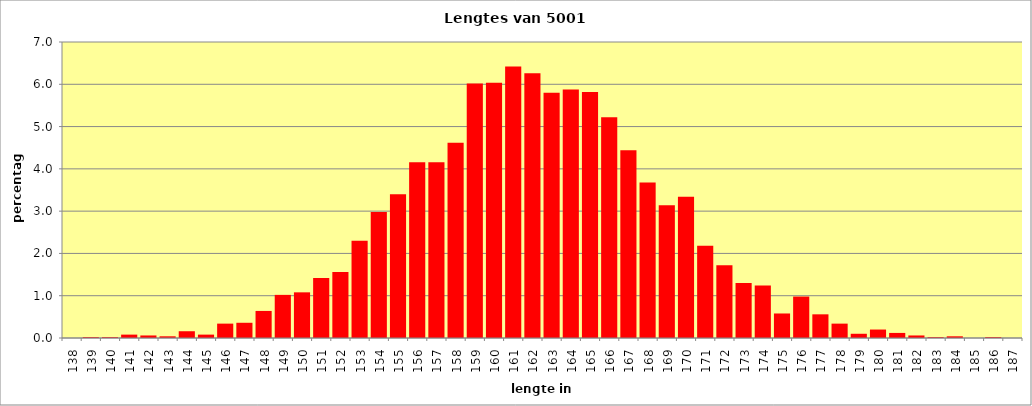
| Category | relatieve frequentie |
|---|---|
| 138.0 | 0 |
| 139.0 | 0.02 |
| 140.0 | 0.02 |
| 141.0 | 0.08 |
| 142.0 | 0.06 |
| 143.0 | 0.04 |
| 144.0 | 0.16 |
| 145.0 | 0.08 |
| 146.0 | 0.34 |
| 147.0 | 0.36 |
| 148.0 | 0.64 |
| 149.0 | 1.02 |
| 150.0 | 1.08 |
| 151.0 | 1.42 |
| 152.0 | 1.56 |
| 153.0 | 2.3 |
| 154.0 | 2.979 |
| 155.0 | 3.399 |
| 156.0 | 4.159 |
| 157.0 | 4.159 |
| 158.0 | 4.619 |
| 159.0 | 6.019 |
| 160.0 | 6.039 |
| 161.0 | 6.419 |
| 162.0 | 6.259 |
| 163.0 | 5.799 |
| 164.0 | 5.879 |
| 165.0 | 5.819 |
| 166.0 | 5.219 |
| 167.0 | 4.439 |
| 168.0 | 3.679 |
| 169.0 | 3.139 |
| 170.0 | 3.339 |
| 171.0 | 2.18 |
| 172.0 | 1.72 |
| 173.0 | 1.3 |
| 174.0 | 1.24 |
| 175.0 | 0.58 |
| 176.0 | 0.98 |
| 177.0 | 0.56 |
| 178.0 | 0.34 |
| 179.0 | 0.1 |
| 180.0 | 0.2 |
| 181.0 | 0.12 |
| 182.0 | 0.06 |
| 183.0 | 0.02 |
| 184.0 | 0.04 |
| 185.0 | 0 |
| 186.0 | 0.02 |
| 187.0 | 0 |